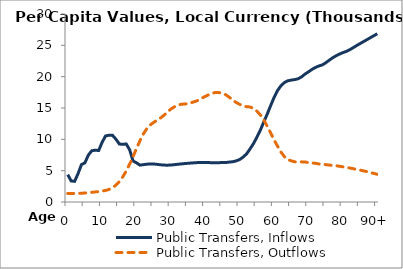
| Category | Public Transfers, Inflows | Public Transfers, Outflows |
|---|---|---|
| 0 | 4373.073 | 1355.234 |
|  | 3364.149 | 1356.789 |
| 2 | 3294.755 | 1358.343 |
| 3 | 4523.792 | 1369.007 |
| 4 | 5974.694 | 1394.874 |
| 5 | 6254.643 | 1438.23 |
| 6 | 7490.238 | 1490.916 |
| 7 | 8180.639 | 1544.765 |
| 8 | 8263.726 | 1606.492 |
| 9 | 8221.612 | 1669.243 |
| 10 | 9522.065 | 1747.773 |
| 11 | 10544.697 | 1840.474 |
| 12 | 10648.225 | 2012.124 |
| 13 | 10651.532 | 2278.331 |
| 14 | 10038.384 | 2690.159 |
| 15 | 9255.342 | 3242.725 |
| 16 | 9198.64 | 4004.65 |
| 17 | 9264.479 | 4932.911 |
| 18 | 8340.582 | 6027.194 |
| 19 | 6540.76 | 7252.707 |
| 20 | 6248.171 | 8542.824 |
| 21 | 5884.275 | 9772.877 |
| 22 | 5959.594 | 10863.901 |
| 23 | 6034.913 | 11714.415 |
| 24 | 6067.367 | 12289.785 |
| 25 | 6062.462 | 12710.664 |
| 26 | 6005.405 | 13060.384 |
| 27 | 5937.206 | 13415.879 |
| 28 | 5886.867 | 13845.813 |
| 29 | 5878.2 | 14364.606 |
| 30 | 5898.166 | 14835.488 |
| 31 | 5958.103 | 15182.642 |
| 32 | 6021.707 | 15425.709 |
| 33 | 6077.434 | 15605.525 |
| 34 | 6132.768 | 15633.933 |
| 35 | 6177.757 | 15705.674 |
| 36 | 6222.984 | 15857.508 |
| 37 | 6260.888 | 16041.216 |
| 38 | 6300.959 | 16235.696 |
| 39 | 6300.737 | 16573.209 |
| 40 | 6298.017 | 16853.212 |
| 41 | 6289.69 | 17123.306 |
| 42 | 6270.684 | 17354.884 |
| 43 | 6257.093 | 17476.627 |
| 44 | 6277.448 | 17465.568 |
| 45 | 6295.367 | 17342.849 |
| 46 | 6305.926 | 17102.141 |
| 47 | 6369.774 | 16703.917 |
| 48 | 6426.557 | 16258.674 |
| 49 | 6561.752 | 15863.535 |
| 50 | 6776.518 | 15581.703 |
| 51 | 7167.731 | 15323.461 |
| 52 | 7678.555 | 15214.579 |
| 53 | 8464.855 | 15165.064 |
| 54 | 9311.754 | 14929.195 |
| 55 | 10337.473 | 14493.751 |
| 56 | 11460.284 | 13901.016 |
| 57 | 12761.699 | 13102.623 |
| 58 | 14018.404 | 12092.851 |
| 59 | 15380.215 | 11022.861 |
| 60 | 16695.289 | 9913.107 |
| 61 | 17785.099 | 8910.733 |
| 62 | 18554.56 | 7967.416 |
| 63 | 19060.476 | 7236.658 |
| 64 | 19344.972 | 6767.065 |
| 65 | 19455.836 | 6564.347 |
| 66 | 19533.369 | 6409.427 |
| 67 | 19670.921 | 6380.003 |
| 68 | 19971.507 | 6405.143 |
| 69 | 20416.456 | 6382.729 |
| 70 | 20767.846 | 6285.963 |
| 71 | 21150.205 | 6230.644 |
| 72 | 21464.386 | 6179.255 |
| 73 | 21702.775 | 6074.94 |
| 74 | 21871.235 | 6017.236 |
| 75 | 22208.679 | 5962.214 |
| 76 | 22617.392 | 5897.179 |
| 77 | 23001.474 | 5832.859 |
| 78 | 23325.152 | 5793.548 |
| 79 | 23597.814 | 5700.286 |
| 80 | 23839.955 | 5615.03 |
| 81 | 24029.852 | 5525.727 |
| 82 | 24296.472 | 5425.721 |
| 83 | 24627 | 5315.149 |
| 84 | 24963.5 | 5209.007 |
| 85 | 25279.912 | 5093.91 |
| 86 | 25594.992 | 4969.815 |
| 87 | 25909.329 | 4840.435 |
| 88 | 26222.926 | 4703.426 |
| 89 | 26536.152 | 4563.296 |
| 90+ | 26849.379 | 4423.167 |